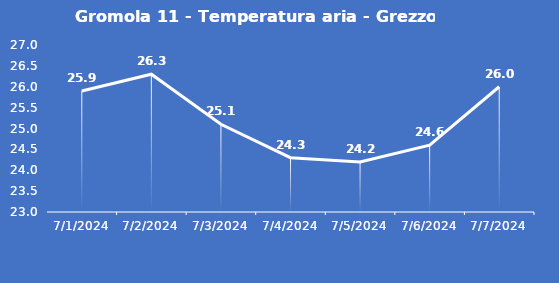
| Category | Gromola 11 - Temperatura aria - Grezzo (°C) |
|---|---|
| 7/1/24 | 25.9 |
| 7/2/24 | 26.3 |
| 7/3/24 | 25.1 |
| 7/4/24 | 24.3 |
| 7/5/24 | 24.2 |
| 7/6/24 | 24.6 |
| 7/7/24 | 26 |